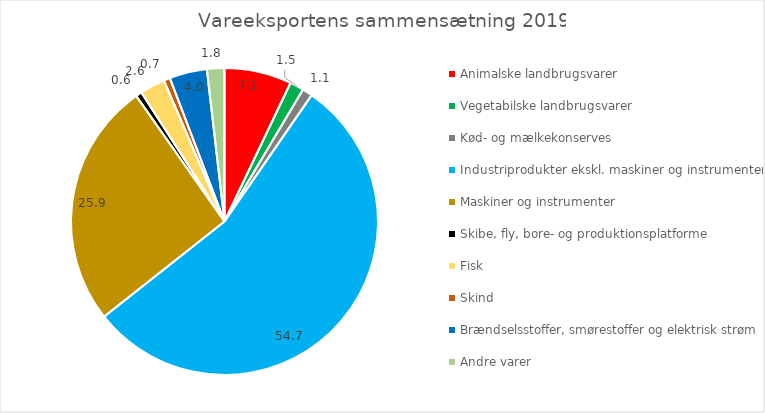
| Category | Vareeksportens sammensætning 2019 |
|---|---|
| Animalske landbrugsvarer | 7.074 |
| Vegetabilske landbrugsvarer | 1.468 |
| Kød- og mælkekonserves | 1.069 |
| Industriprodukter ekskl. maskiner og instrumenter | 54.74 |
| Maskiner og instrumenter | 25.895 |
| Skibe, fly, bore- og produktionsplatforme | 0.645 |
| Fisk | 2.647 |
| Skind | 0.666 |
| Brændselsstoffer, smørestoffer og elektrisk strøm | 3.958 |
| Andre varer | 1.838 |